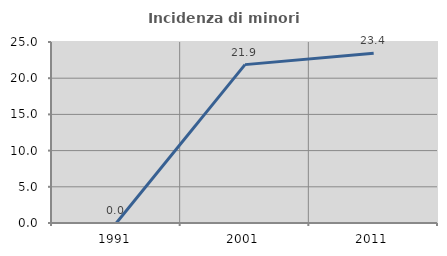
| Category | Incidenza di minori stranieri |
|---|---|
| 1991.0 | 0 |
| 2001.0 | 21.875 |
| 2011.0 | 23.438 |